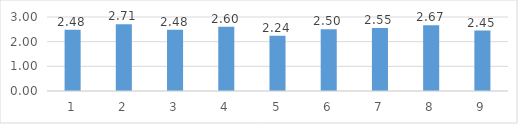
| Category | Series 0 |
|---|---|
| 0 | 2.48 |
| 1 | 2.71 |
| 2 | 2.48 |
| 3 | 2.6 |
| 4 | 2.24 |
| 5 | 2.5 |
| 6 | 2.55 |
| 7 | 2.67 |
| 8 | 2.45 |